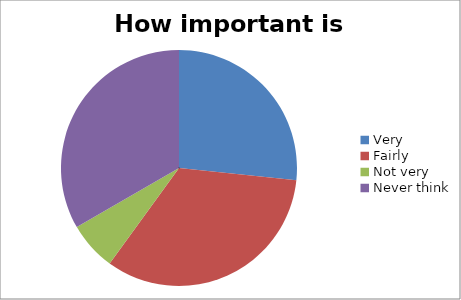
| Category | Series 0 |
|---|---|
| Very | 4 |
| Fairly | 5 |
| Not very | 1 |
| Never think | 5 |